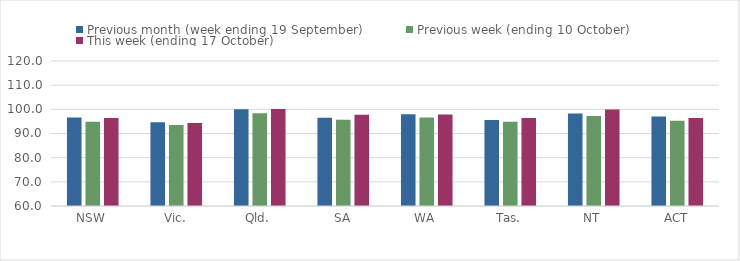
| Category | Previous month (week ending 19 September) | Previous week (ending 10 October) | This week (ending 17 October) |
|---|---|---|---|
| NSW | 96.61 | 94.83 | 96.43 |
| Vic. | 94.63 | 93.55 | 94.34 |
| Qld. | 100.06 | 98.35 | 100.12 |
| SA | 96.51 | 95.74 | 97.71 |
| WA | 97.93 | 96.63 | 97.83 |
| Tas. | 95.61 | 94.84 | 96.39 |
| NT | 98.25 | 97.2 | 99.98 |
| ACT | 97.02 | 95.23 | 96.45 |